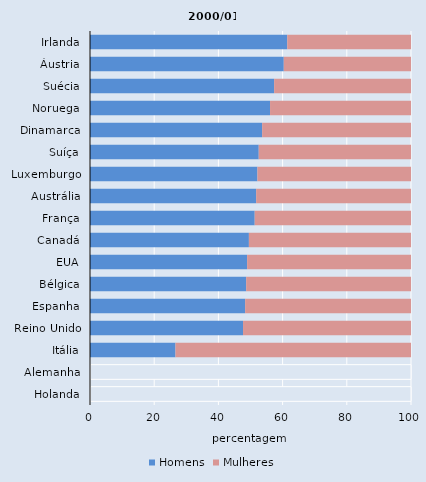
| Category | Homens | Mulheres |
|---|---|---|
| Irlanda | 61.453 | 38.547 |
| Áustria | 60.367 | 39.633 |
| Suécia | 57.363 | 42.637 |
| Noruega | 56.089 | 43.911 |
| Dinamarca | 53.628 | 46.372 |
| Suíça | 52.567 | 47.433 |
| Luxemburgo | 52.156 | 47.844 |
| Austrália | 51.768 | 48.232 |
| França | 51.311 | 48.689 |
| Canadá | 49.502 | 50.498 |
| EUA | 48.951 | 51.049 |
| Bélgica | 48.656 | 51.344 |
| Espanha | 48.334 | 51.666 |
| Reino Unido | 47.674 | 52.326 |
| Itália | 26.629 | 73.371 |
| Alemanha | 100 | 0 |
| Holanda | 100 | 0 |